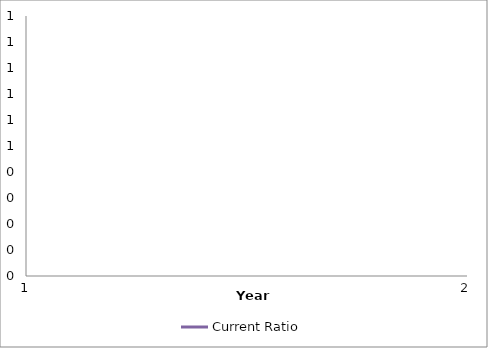
| Category | Current Ratio |
|---|---|
| 0 | 0 |
| 1 | 0 |
| 2 | 0 |
| 3 | 0 |
| 4 | 0 |
| 5 | 0 |
| 6 | 0 |
| 7 | 0 |
| 8 | 0 |
| 9 | 0 |